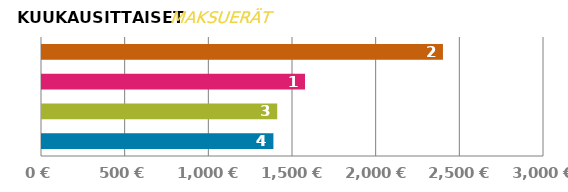
| Category | MAKSU |
|---|---|
| 0 | 1382.921 |
| 1 | 1405.775 |
| 2 | 1571.655 |
| 3 | 2396.046 |